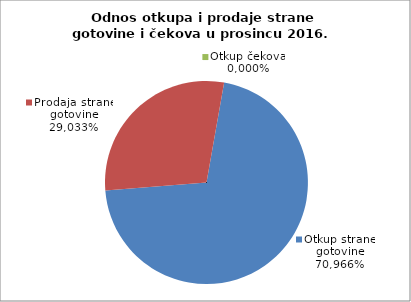
| Category | Otkup strane gotovine |
|---|---|
| 0 | 0.71 |
| 1 | 0.29 |
| 2 | 0 |